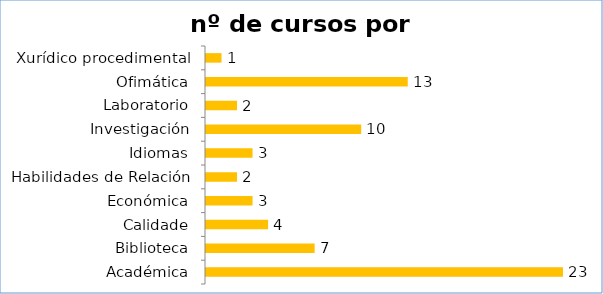
| Category | nº de cursos |
|---|---|
| Académica | 23 |
| Biblioteca | 7 |
| Calidade | 4 |
| Económica | 3 |
| Habilidades de Relación | 2 |
| Idiomas | 3 |
| Investigación | 10 |
| Laboratorio | 2 |
| Ofimática | 13 |
| Xurídico procedimental | 1 |